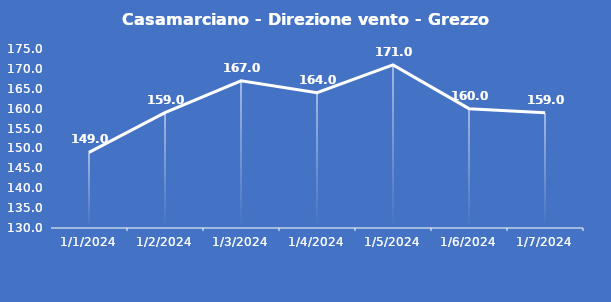
| Category | Casamarciano - Direzione vento - Grezzo (°N) |
|---|---|
| 1/1/24 | 149 |
| 1/2/24 | 159 |
| 1/3/24 | 167 |
| 1/4/24 | 164 |
| 1/5/24 | 171 |
| 1/6/24 | 160 |
| 1/7/24 | 159 |